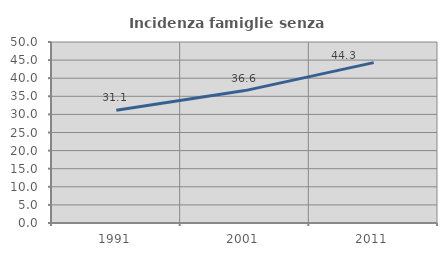
| Category | Incidenza famiglie senza nuclei |
|---|---|
| 1991.0 | 31.133 |
| 2001.0 | 36.575 |
| 2011.0 | 44.297 |